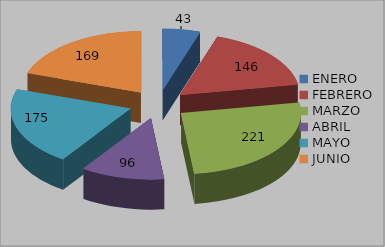
| Category | Series 0 |
|---|---|
| ENERO | 43 |
| FEBRERO | 146 |
| MARZO | 221 |
| ABRIL | 96 |
| MAYO | 175 |
| JUNIO | 169 |